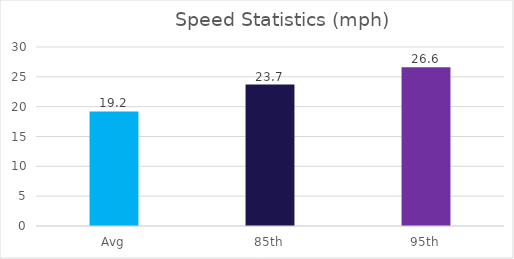
| Category | Series 0 |
|---|---|
| Avg | 19.2 |
| 85th | 23.7 |
| 95th | 26.6 |